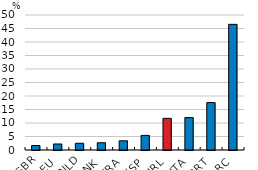
| Category | National NPL ratio |
|---|---|
| GBR | 1.65 |
| DEU | 2.23 |
| NLD | 2.49 |
| DNK | 2.69 |
| FRA | 3.41 |
| ESP | 5.41 |
| IRL | 11.72 |
| ITA | 12.01 |
| PRT | 17.56 |
| GRC | 46.54 |